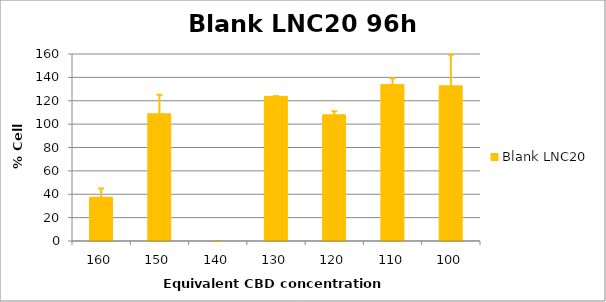
| Category | Blank LNC20 |
|---|---|
| 160.0 | 37.472 |
| 150.0 | 108.885 |
| 140.0 | 0 |
| 130.0 | 123.75 |
| 120.0 | 107.968 |
| 110.0 | 133.977 |
| 100.0 | 132.754 |